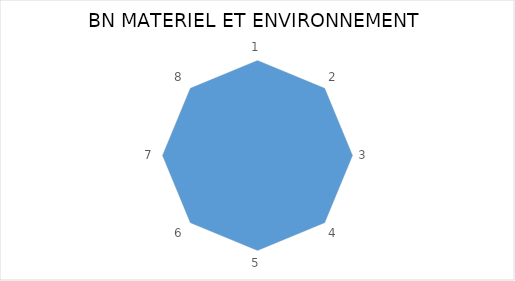
| Category | Series 0 |
|---|---|
| 0 | 1 |
| 1 | 1 |
| 2 | 1 |
| 3 | 1 |
| 4 | 1 |
| 5 | 1 |
| 6 | 1 |
| 7 | 1 |